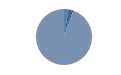
| Category | Series 0 |
|---|---|
| ARRASTRE | 69 |
| CERCO | 53 |
| PALANGRE | 22 |
| REDES DE ENMALLE | 2 |
| ARTES FIJAS | 1 |
| ARTES MENORES | 2528 |